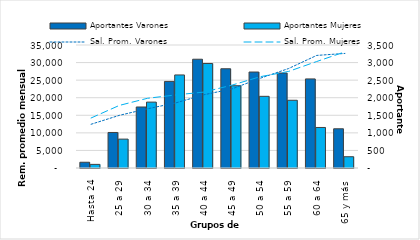
| Category | Aportantes Varones | Aportantes Mujeres |
|---|---|---|
| Hasta 24 | 164 | 103 |
| 25 a 29 | 1011 | 822 |
| 30 a 34 | 1736 | 1875 |
| 35 a 39 | 2464 | 2648 |
| 40 a 44 | 3095 | 2974 |
| 45 a 49 | 2824 | 2341 |
| 50 a 54 | 2731 | 2039 |
| 55 a 59 | 2702 | 1927 |
| 60 a 64 | 2535 | 1153 |
| 65 y más | 1116 | 321 |